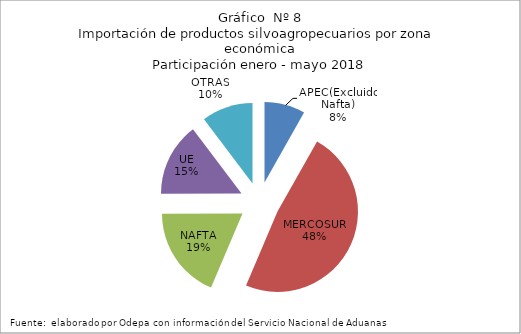
| Category | Series 0 |
|---|---|
| APEC(Excluido Nafta) | 215536.319 |
| MERCOSUR | 1270517.863 |
| NAFTA | 489505.323 |
| UE | 388589.723 |
| OTRAS | 271299.773 |